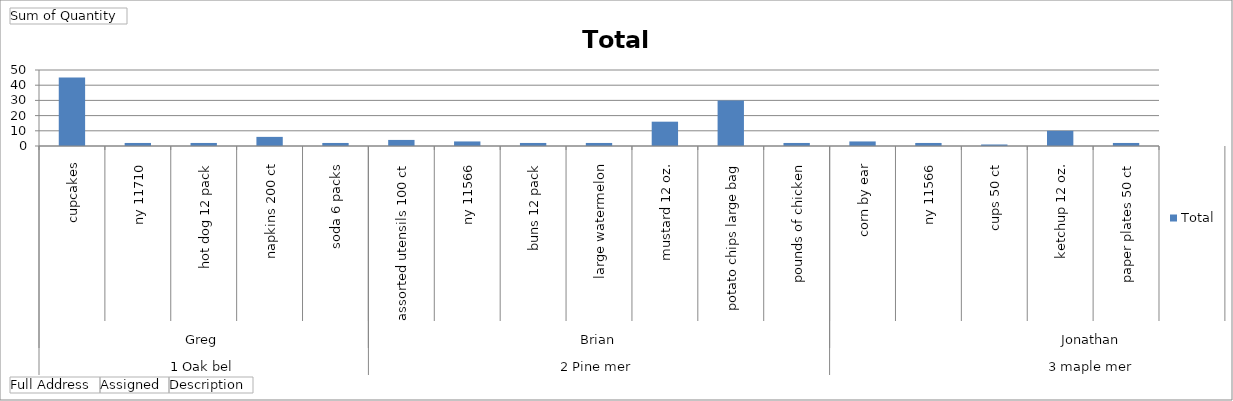
| Category | Total |
|---|---|
| 0 | 45 |
| 1 | 2 |
| 2 | 2 |
| 3 | 6 |
| 4 | 2 |
| 5 | 4 |
| 6 | 3 |
| 7 | 2 |
| 8 | 2 |
| 9 | 16 |
| 10 | 30 |
| 11 | 2 |
| 12 | 3 |
| 13 | 2 |
| 14 | 1 |
| 15 | 10 |
| 16 | 2 |